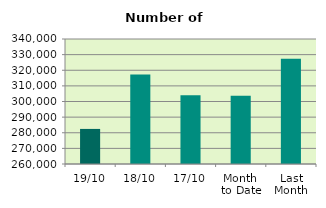
| Category | Series 0 |
|---|---|
| 19/10 | 282450 |
| 18/10 | 317252 |
| 17/10 | 304080 |
| Month 
to Date | 303690.615 |
| Last
Month | 327317.909 |